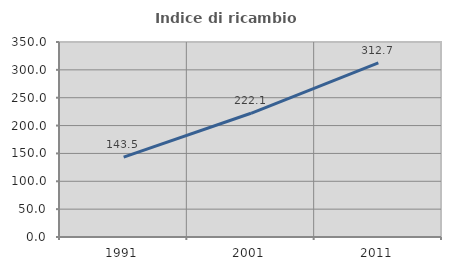
| Category | Indice di ricambio occupazionale  |
|---|---|
| 1991.0 | 143.487 |
| 2001.0 | 222.075 |
| 2011.0 | 312.682 |